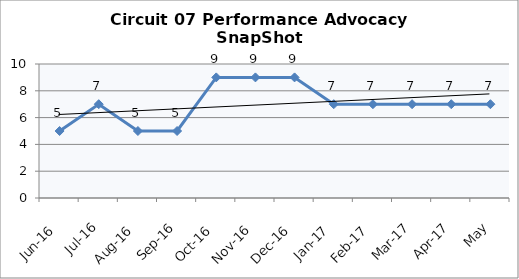
| Category | Circuit 07 |
|---|---|
| Jun-16 | 5 |
| Jul-16 | 7 |
| Aug-16 | 5 |
| Sep-16 | 5 |
| Oct-16 | 9 |
| Nov-16 | 9 |
| Dec-16 | 9 |
| Jan-17 | 7 |
| Feb-17 | 7 |
| Mar-17 | 7 |
| Apr-17 | 7 |
| May | 7 |